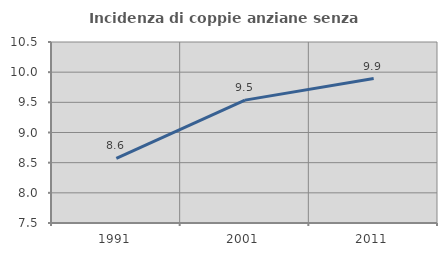
| Category | Incidenza di coppie anziane senza figli  |
|---|---|
| 1991.0 | 8.573 |
| 2001.0 | 9.536 |
| 2011.0 | 9.894 |